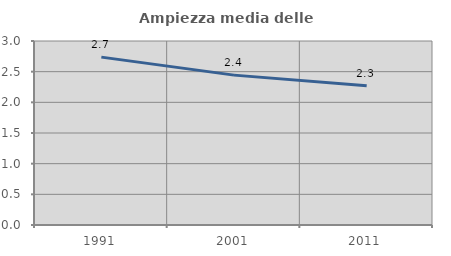
| Category | Ampiezza media delle famiglie |
|---|---|
| 1991.0 | 2.737 |
| 2001.0 | 2.444 |
| 2011.0 | 2.269 |